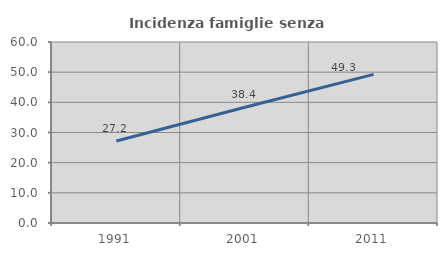
| Category | Incidenza famiglie senza nuclei |
|---|---|
| 1991.0 | 27.181 |
| 2001.0 | 38.359 |
| 2011.0 | 49.26 |